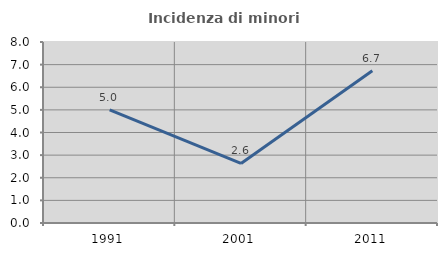
| Category | Incidenza di minori stranieri |
|---|---|
| 1991.0 | 5 |
| 2001.0 | 2.632 |
| 2011.0 | 6.731 |